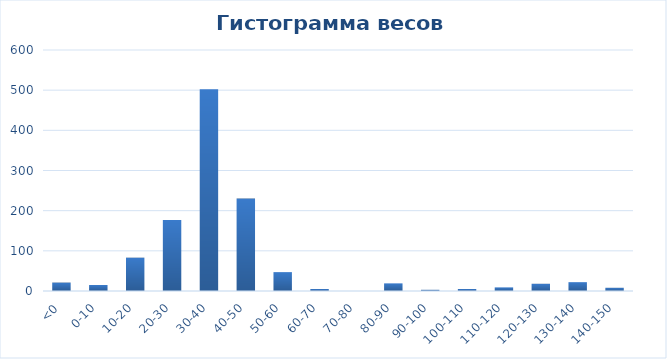
| Category | Series 0 |
|---|---|
| <0 | 21 |
| 0-10 | 15 |
| 10-20 | 83 |
| 20-30 | 177 |
| 30-40 | 502 |
| 40-50 | 230 |
| 50-60 | 47 |
| 60-70 | 5 |
| 70-80 | 0 |
| 80-90 | 19 |
| 90-100 | 3 |
| 100-110 | 5 |
| 110-120 | 9 |
| 120-130 | 18 |
| 130-140 | 22 |
| 140-150 | 8 |